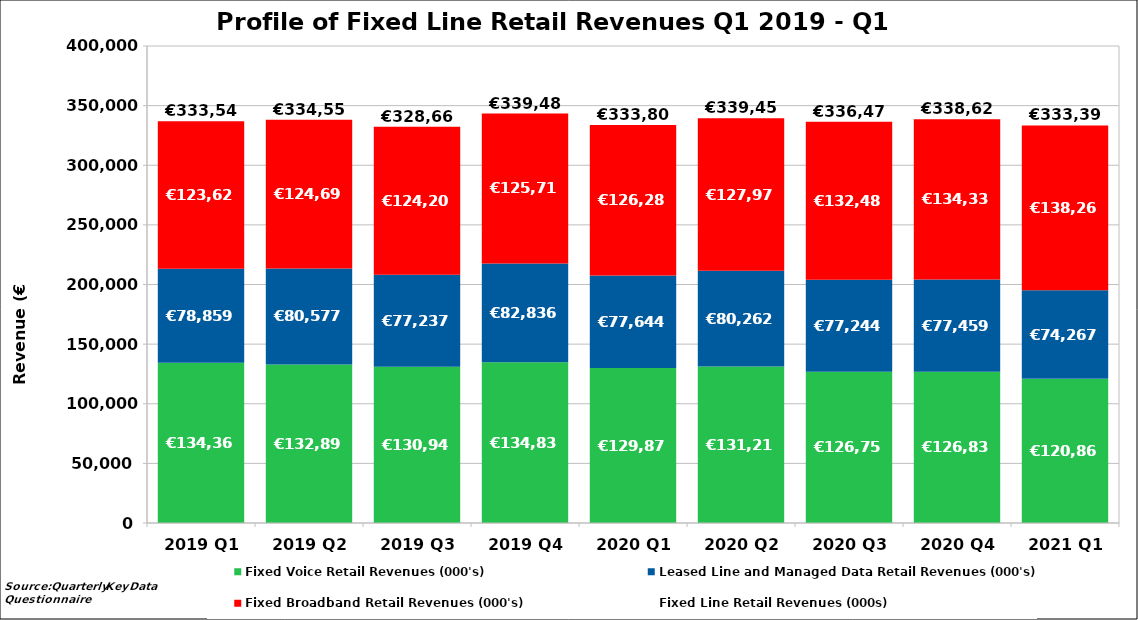
| Category | Fixed Voice Retail Revenues (000's) | Leased Line and Managed Data Retail Revenues (000's) | Fixed Broadband Retail Revenues (000's) | Fixed Line Retail Revenues (000s) |
|---|---|---|---|---|
| 2019 Q1 | 134363.642 | 78859.119 | 123629.125 | 333546.469 |
| 2019 Q2 | 132889.679 | 80576.923 | 124694.585 | 334555.661 |
| 2019 Q3 | 130946.24 | 77236.7 | 124204.439 | 328666.506 |
| 2019 Q4 | 134837.825 | 82836.465 | 125716.694 | 339487.178 |
| 2020 Q1 | 129879.079 | 77644.335 | 126285 | 333808.414 |
| 2020 Q2 | 131214.407 | 80261.523 | 127977 | 339452.93 |
| 2020 Q3 | 126751.235 | 77244.016 | 132484 | 336479.251 |
| 2020 Q4 | 126835.629 | 77458.51 | 134334 | 338628.139 |
| 2021 Q1 | 120859.535 | 74266.584 | 138268 | 333394.119 |